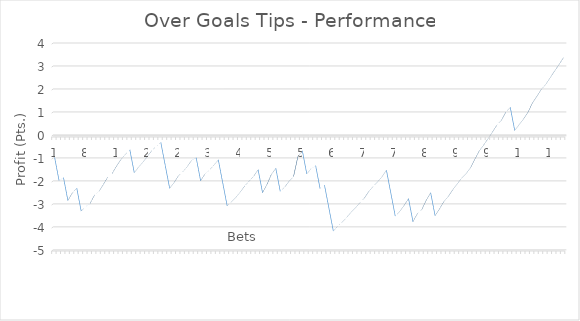
| Category | Series 0 |
|---|---|
| 0 | -1 |
| 1 | -2 |
| 2 | -1.87 |
| 3 | -2.87 |
| 4 | -2.54 |
| 5 | -2.33 |
| 6 | -3.33 |
| 7 | -3.13 |
| 8 | -3 |
| 9 | -2.64 |
| 10 | -2.48 |
| 11 | -2.18 |
| 12 | -1.85 |
| 13 | -1.7 |
| 14 | -1.37 |
| 15 | -1.08 |
| 16 | -0.86 |
| 17 | -0.66 |
| 18 | -1.66 |
| 19 | -1.41 |
| 20 | -1.19 |
| 21 | -0.94 |
| 22 | -0.69 |
| 23 | -0.51 |
| 24 | -0.34 |
| 25 | -1.34 |
| 26 | -2.34 |
| 27 | -2.09 |
| 28 | -1.79 |
| 29 | -1.61 |
| 30 | -1.39 |
| 31 | -1.11 |
| 32 | -1.01 |
| 33 | -2.01 |
| 34 | -1.71 |
| 35 | -1.54 |
| 36 | -1.33 |
| 37 | -1.1 |
| 38 | -2.1 |
| 39 | -3.1 |
| 40 | -2.92 |
| 41 | -2.73 |
| 42 | -2.49 |
| 43 | -2.23 |
| 44 | -2.02 |
| 45 | -1.81 |
| 46 | -1.53 |
| 47 | -2.53 |
| 48 | -2.17 |
| 49 | -1.73 |
| 50 | -1.47 |
| 51 | -2.47 |
| 52 | -2.29 |
| 53 | -2.03 |
| 54 | -1.83 |
| 55 | -0.95 |
| 56 | -0.71 |
| 57 | -1.71 |
| 58 | -1.48 |
| 59 | -1.35 |
| 60 | -2.35 |
| 61 | -2.2 |
| 62 | -3.2 |
| 63 | -4.2 |
| 64 | -3.98 |
| 65 | -3.81 |
| 66 | -3.61 |
| 67 | -3.38 |
| 68 | -3.19 |
| 69 | -2.97 |
| 70 | -2.77 |
| 71 | -2.48 |
| 72 | -2.26 |
| 73 | -2.06 |
| 74 | -1.84 |
| 75 | -1.55 |
| 76 | -2.55 |
| 77 | -3.55 |
| 78 | -3.35 |
| 79 | -3.08 |
| 80 | -2.79 |
| 81 | -3.79 |
| 82 | -3.44 |
| 83 | -3.26 |
| 84 | -2.86 |
| 85 | -2.53 |
| 86 | -3.53 |
| 87 | -3.24 |
| 88 | -2.91 |
| 89 | -2.69 |
| 90 | -2.4 |
| 91 | -2.15 |
| 92 | -1.9 |
| 93 | -1.7 |
| 94 | -1.45 |
| 95 | -1.07 |
| 96 | -0.71 |
| 97 | -0.45 |
| 98 | -0.17 |
| 99 | 0.12 |
| 100 | 0.42 |
| 101 | 0.62 |
| 102 | 0.98 |
| 103 | 1.18 |
| 104 | 0.18 |
| 105 | 0.43 |
| 106 | 0.68 |
| 107 | 0.97 |
| 108 | 1.37 |
| 109 | 1.66 |
| 110 | 1.96 |
| 111 | 2.18 |
| 112 | 2.47 |
| 113 | 2.76 |
| 114 | 3.04 |
| 115 | 3.34 |